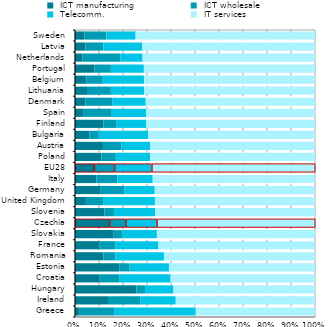
| Category |  ICT manufacturing |  ICT wholesale |  Telecomm. |  IT services |
|---|---|---|---|---|
| Greece | 0.02 | 0.143 | 0.34 | 0.497 |
| Ireland | 0.138 | 0.136 | 0.146 | 0.58 |
| Hungary | 0.256 | 0.035 | 0.119 | 0.59 |
| Croatia | 0.101 | 0.083 | 0.214 | 0.602 |
| Estonia | 0.184 | 0.044 | 0.163 | 0.609 |
| Romania | 0.119 | 0.049 | 0.202 | 0.629 |
| France | 0.101 | 0.068 | 0.179 | 0.652 |
| Slovakia | 0.161 | 0.037 | 0.143 | 0.659 |
| Czechia | 0.143 | 0.068 | 0.13 | 0.659 |
| Slovenia | 0.123 | 0.039 | 0.171 | 0.667 |
| United Kingdom | 0.045 | 0.072 | 0.216 | 0.667 |
| Germany | 0.105 | 0.101 | 0.127 | 0.668 |
| Italy | 0.089 | 0.088 | 0.147 | 0.676 |
| EU28 | 0.08 | 0.084 | 0.155 | 0.681 |
| Poland | 0.11 | 0.06 | 0.144 | 0.686 |
| Austria | 0.116 | 0.077 | 0.119 | 0.687 |
| Bulgaria | 0.06 | 0.04 | 0.206 | 0.695 |
| Finland | 0.119 | 0.055 | 0.123 | 0.703 |
| Spain | 0.034 | 0.12 | 0.142 | 0.704 |
| Denmark | 0.043 | 0.114 | 0.138 | 0.705 |
| Lithuania | 0.05 | 0.1 | 0.139 | 0.711 |
| Belgium | 0.047 | 0.069 | 0.171 | 0.713 |
| Portugal | 0.082 | 0.068 | 0.137 | 0.713 |
| Netherlands | 0.032 | 0.158 | 0.092 | 0.718 |
| Latvia | 0.044 | 0.074 | 0.162 | 0.72 |
| Sweden | 0.04 | 0.091 | 0.122 | 0.747 |